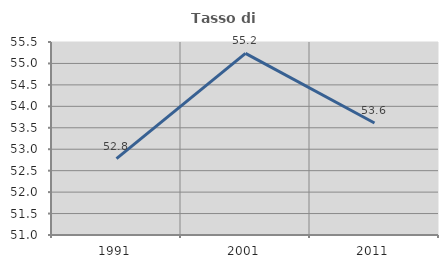
| Category | Tasso di occupazione   |
|---|---|
| 1991.0 | 52.782 |
| 2001.0 | 55.234 |
| 2011.0 | 53.612 |